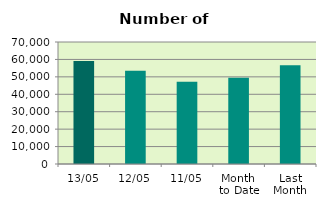
| Category | Series 0 |
|---|---|
| 13/05 | 59076 |
| 12/05 | 53570 |
| 11/05 | 47252 |
| Month 
to Date | 49439.75 |
| Last
Month | 56719.3 |